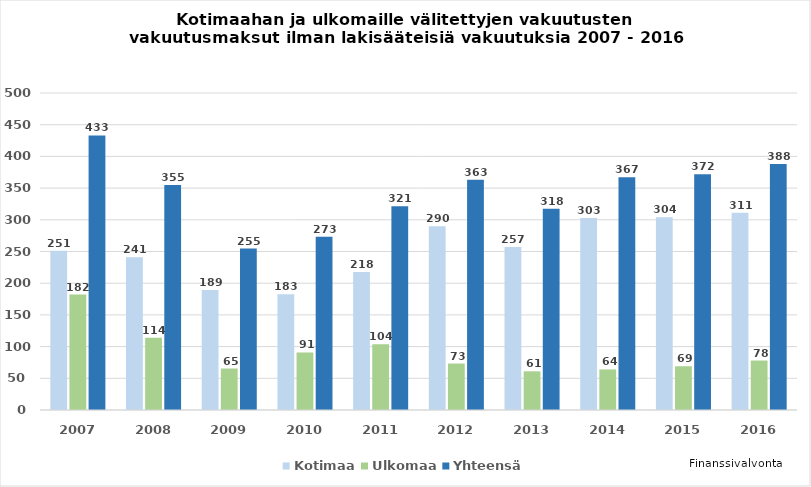
| Category | Kotimaa | Ulkomaa | Yhteensä  |
|---|---|---|---|
| 2007.0 | 251 | 182 | 433 |
| 2008.0 | 241 | 114 | 355 |
| 2009.0 | 189.249 | 65.417 | 254.666 |
| 2010.0 | 182.562 | 90.729 | 273.291 |
| 2011.0 | 217.55 | 103.894 | 321.444 |
| 2012.0 | 289.922 | 73.321 | 363.243 |
| 2013.0 | 257 | 61 | 317.523 |
| 2014.0 | 303 | 64 | 367 |
| 2015.0 | 304 | 69 | 372 |
| 2016.0 | 311 | 78 | 388 |